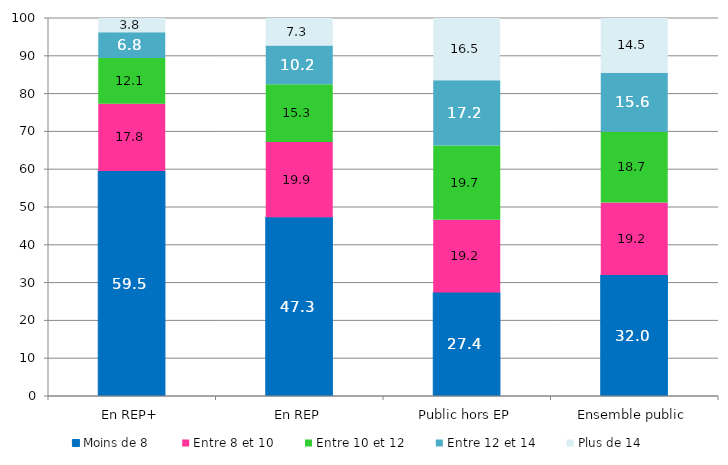
| Category | Moins de 8 | Entre 8 et 10 | Entre 10 et 12 | Entre 12 et 14 | Plus de 14 |
|---|---|---|---|---|---|
| En REP+ | 59.5 | 17.8 | 12.1 | 6.8 | 3.8 |
| En REP | 47.3 | 19.9 | 15.3 | 10.2 | 7.3 |
| Public hors EP | 27.4 | 19.2 | 19.7 | 17.2 | 16.5 |
| Ensemble public | 32 | 19.2 | 18.7 | 15.6 | 14.5 |